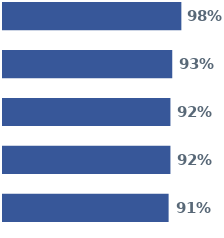
| Category | Series 0 | Series 1 | Series 2 | Series 3 | Series 4 |
|---|---|---|---|---|---|
| 0 | 0.98 | 0.93 | 0.92 | 0.92 | 0.91 |